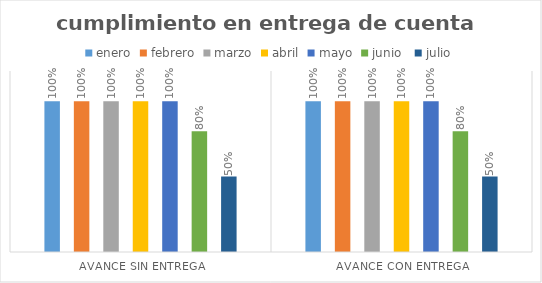
| Category | enero | febrero | marzo | abril | mayo | junio  | julio |
|---|---|---|---|---|---|---|---|
| Avance sin Entrega | 1 | 1 | 1 | 1 | 1 | 0.8 | 0.5 |
| Avance con entrega | 1 | 1 | 1 | 1 | 1 | 0.8 | 0.5 |